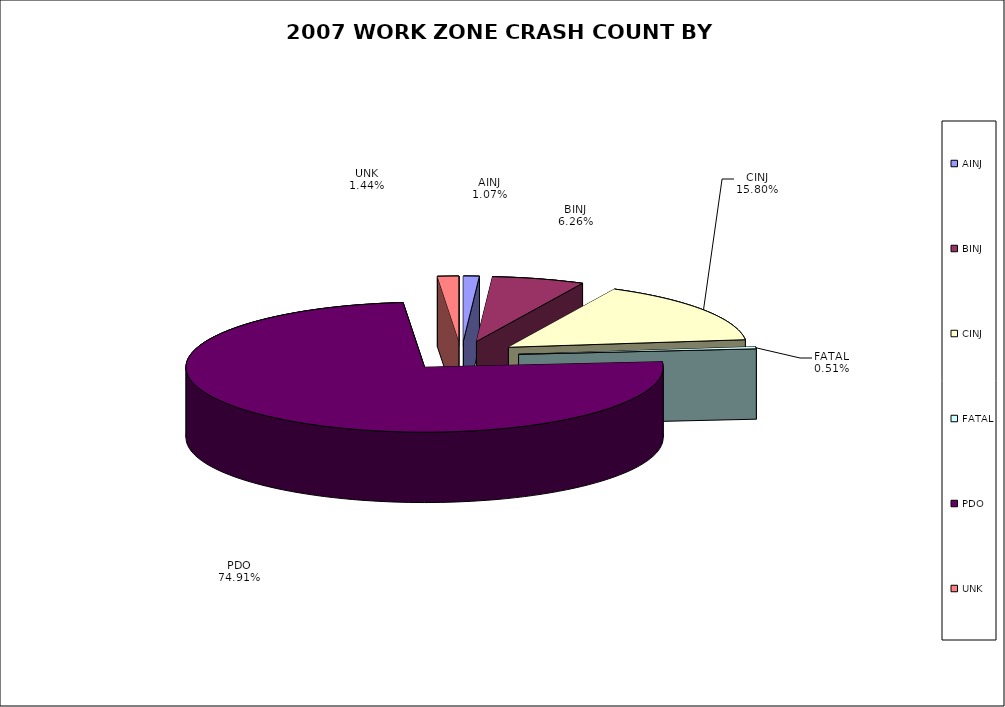
| Category | Series 0 | Series 1 |
|---|---|---|
| AINJ | 67 | 0.011 |
| BINJ | 392 | 0.063 |
| CINJ | 989 | 0.158 |
| FATAL | 32 | 0.005 |
| PDO | 4688 | 0.749 |
| UNK | 90 | 0.014 |